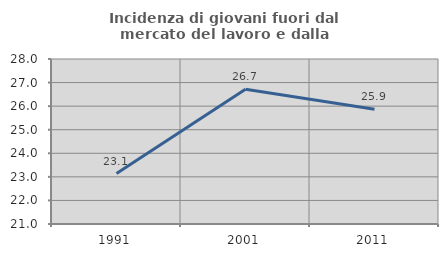
| Category | Incidenza di giovani fuori dal mercato del lavoro e dalla formazione  |
|---|---|
| 1991.0 | 23.14 |
| 2001.0 | 26.715 |
| 2011.0 | 25.869 |